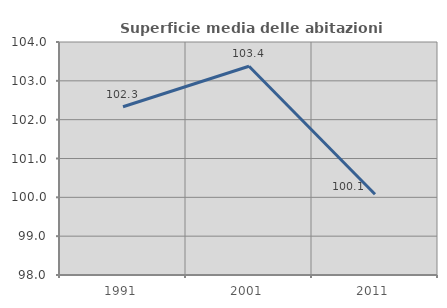
| Category | Superficie media delle abitazioni occupate |
|---|---|
| 1991.0 | 102.333 |
| 2001.0 | 103.375 |
| 2011.0 | 100.081 |